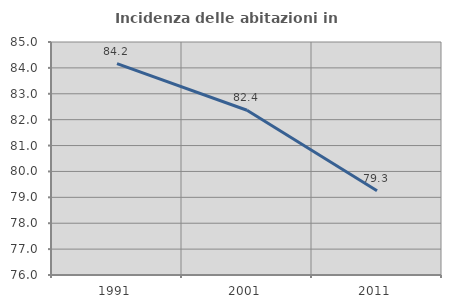
| Category | Incidenza delle abitazioni in proprietà  |
|---|---|
| 1991.0 | 84.167 |
| 2001.0 | 82.364 |
| 2011.0 | 79.252 |